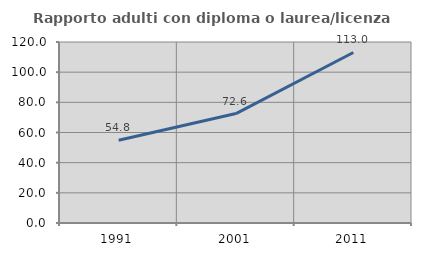
| Category | Rapporto adulti con diploma o laurea/licenza media  |
|---|---|
| 1991.0 | 54.829 |
| 2001.0 | 72.554 |
| 2011.0 | 113.043 |